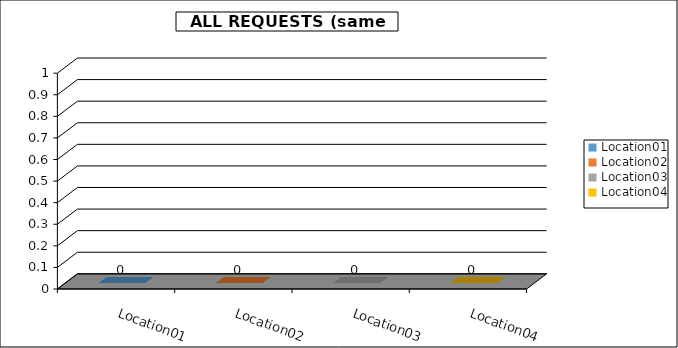
| Category | Series 0 |
|---|---|
| Location01 | 0 |
| Location02 | 0 |
| Location03 | 0 |
| Location04 | 0 |